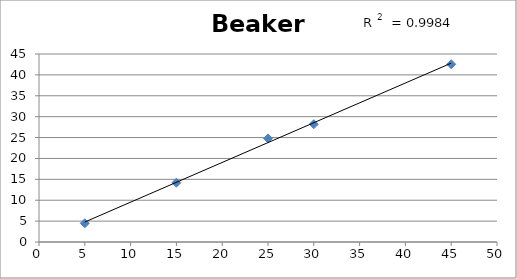
| Category | Mass of Water (g) |
|---|---|
| 5.0 | 4.48 |
| 15.0 | 14.2 |
| 25.0 | 24.8 |
| 30.0 | 28.2 |
| 45.0 | 42.55 |